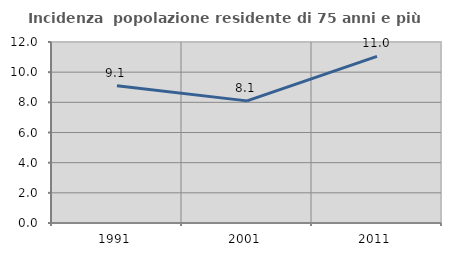
| Category | Incidenza  popolazione residente di 75 anni e più |
|---|---|
| 1991.0 | 9.107 |
| 2001.0 | 8.097 |
| 2011.0 | 11.048 |